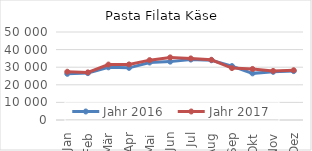
| Category | Jahr 2016 | Jahr 2017 |
|---|---|---|
| Jan | 26248.1 | 27412.514 |
| Feb | 26631.493 | 27056.201 |
| Mär | 29934.362 | 31502.239 |
| Apr | 29627.21 | 31574.67 |
| Mai | 32669.222 | 34009.145 |
| Jun | 33168.61 | 35573.396 |
| Jul | 34353.913 | 34976.126 |
| Aug | 33959.012 | 34203.073 |
| Sep | 30629.041 | 29495.241 |
| Okt | 26497.61 | 28996.197 |
| Nov | 27369.914 | 27870.597 |
| Dez | 27782.126 | 28269.791 |